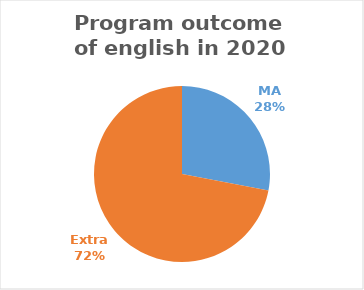
| Category | Series 0 |
|---|---|
| MA | 21 |
| Extra | 54 |